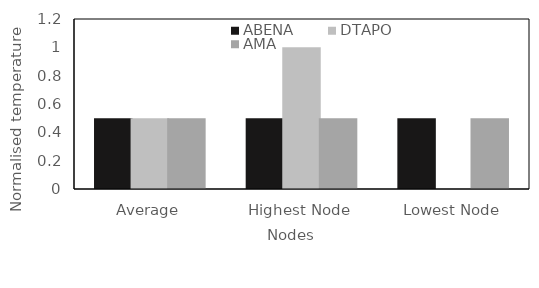
| Category | ABENA | DTAPO | AMA |
|---|---|---|---|
| Average | 0.5 | 0.5 | 0.5 |
| Highest Node | 0.5 | 1 | 0.5 |
| Lowest Node | 0.5 | 0 | 0.5 |